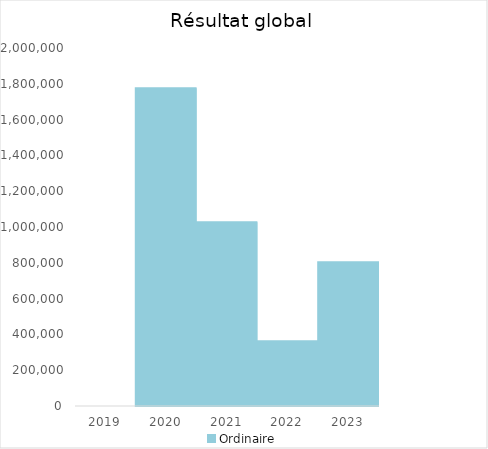
| Category |   | Ordinaire |    |
|---|---|---|---|
| 2019.0 |  | 0 |  |
| 2020.0 |  | 1774930.01 |  |
| 2021.0 |  | 1027168.23 |  |
| 2022.0 |  | 362110.32 |  |
| 2023.0 |  | 802400.11 |  |